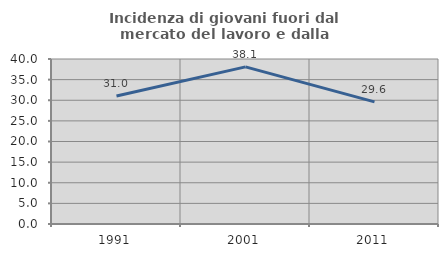
| Category | Incidenza di giovani fuori dal mercato del lavoro e dalla formazione  |
|---|---|
| 1991.0 | 31.033 |
| 2001.0 | 38.087 |
| 2011.0 | 29.604 |